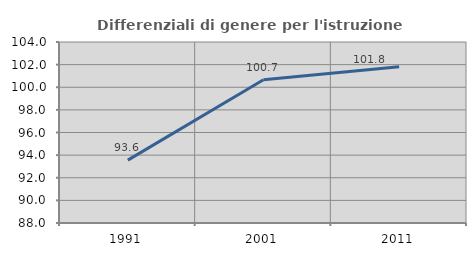
| Category | Differenziali di genere per l'istruzione superiore |
|---|---|
| 1991.0 | 93.561 |
| 2001.0 | 100.667 |
| 2011.0 | 101.81 |